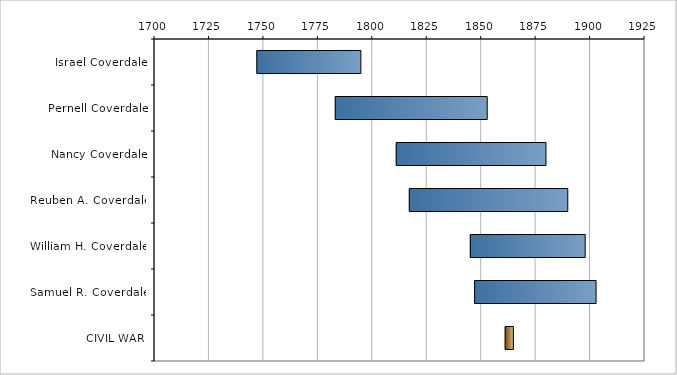
| Category | Blank | Age |
|---|---|---|
| Israel Coverdale | 1747 | 48 |
| Pernell Coverdale | 1783 | 70 |
| Nancy Coverdale | 1811 | 69 |
| Reuben A. Coverdale | 1817 | 73 |
| William H. Coverdale | 1845 | 53 |
| Samuel R. Coverdale | 1847 | 56 |
| CIVIL WAR | 1861 | 4 |